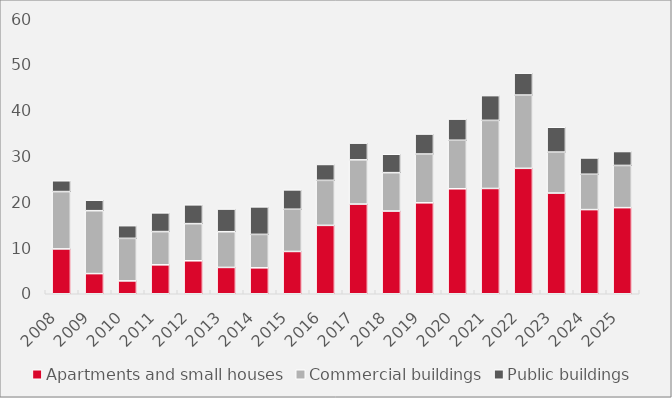
| Category | Apartments and small houses | Commercial buildings | Public buildings |
|---|---|---|---|
| 2008.0 | 9.786 | 12.507 | 2.361 |
| 2009.0 | 4.395 | 13.729 | 2.293 |
| 2010.0 | 2.808 | 9.281 | 2.768 |
| 2011.0 | 6.312 | 7.252 | 4.082 |
| 2012.0 | 7.194 | 8.106 | 4.104 |
| 2013.0 | 5.743 | 7.792 | 4.948 |
| 2014.0 | 5.662 | 7.29 | 6.002 |
| 2015.0 | 9.228 | 9.211 | 4.221 |
| 2016.0 | 14.921 | 9.824 | 3.459 |
| 2017.0 | 19.567 | 9.648 | 3.651 |
| 2018.0 | 18.043 | 8.377 | 4.016 |
| 2019.0 | 19.843 | 10.642 | 4.359 |
| 2020.0 | 22.905 | 10.584 | 4.619 |
| 2021.0 | 22.972 | 14.857 | 5.404 |
| 2022.0 | 27.368 | 15.983 | 4.772 |
| 2023.0 | 21.97 | 8.94 | 5.417 |
| 2024.0 | 18.358 | 7.712 | 3.558 |
| 2025.0 | 18.785 | 9.209 | 3.036 |